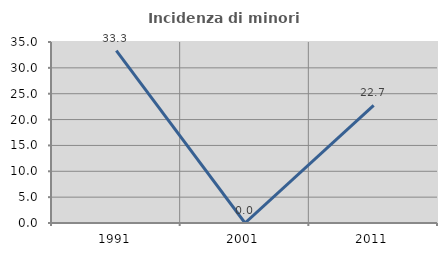
| Category | Incidenza di minori stranieri |
|---|---|
| 1991.0 | 33.333 |
| 2001.0 | 0 |
| 2011.0 | 22.727 |